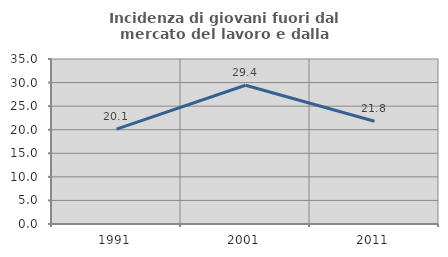
| Category | Incidenza di giovani fuori dal mercato del lavoro e dalla formazione  |
|---|---|
| 1991.0 | 20.132 |
| 2001.0 | 29.423 |
| 2011.0 | 21.81 |